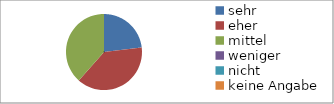
| Category | Series 0 |
|---|---|
| sehr | 3 |
| eher | 5 |
| mittel | 5 |
| weniger | 0 |
| nicht  | 0 |
| keine Angabe | 0 |